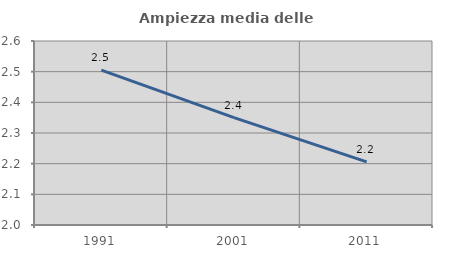
| Category | Ampiezza media delle famiglie |
|---|---|
| 1991.0 | 2.505 |
| 2001.0 | 2.35 |
| 2011.0 | 2.206 |